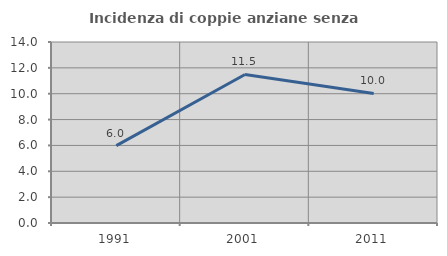
| Category | Incidenza di coppie anziane senza figli  |
|---|---|
| 1991.0 | 5.981 |
| 2001.0 | 11.488 |
| 2011.0 | 10.023 |